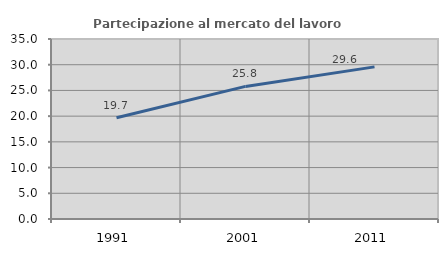
| Category | Partecipazione al mercato del lavoro  femminile |
|---|---|
| 1991.0 | 19.679 |
| 2001.0 | 25.784 |
| 2011.0 | 29.577 |